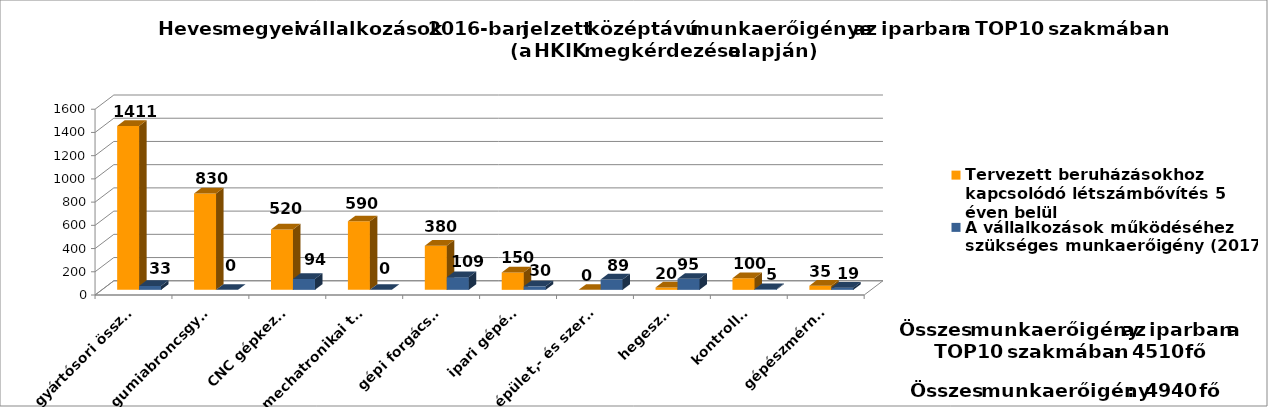
| Category | Tervezett beruházásokhoz kapcsolódó létszámbővítés 5 éven belül | A vállalkozások működéséhez szükséges munkaerőigény (2017) |
|---|---|---|
| gyártósori összeszerelő | 1411 | 33 |
| gumiabroncsgyártó | 830 | 0 |
| CNC gépkezelő | 520 | 94 |
| mechatronikai technikus | 590 | 0 |
| gépi forgácsoló | 380 | 109 |
| ipari gépész | 150 | 30 |
| épület,- és szerkezetlakatos | 0 | 89 |
| hegesztő | 20 | 95 |
| kontroller | 100 | 5 |
| gépészmérnök | 35 | 19 |